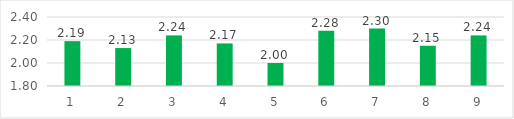
| Category | Series 0 |
|---|---|
| 0 | 2.19 |
| 1 | 2.13 |
| 2 | 2.24 |
| 3 | 2.17 |
| 4 | 2 |
| 5 | 2.28 |
| 6 | 2.3 |
| 7 | 2.15 |
| 8 | 2.24 |